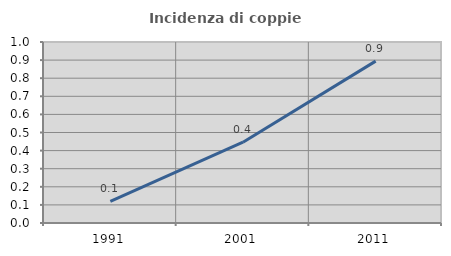
| Category | Incidenza di coppie miste |
|---|---|
| 1991.0 | 0.119 |
| 2001.0 | 0.446 |
| 2011.0 | 0.894 |